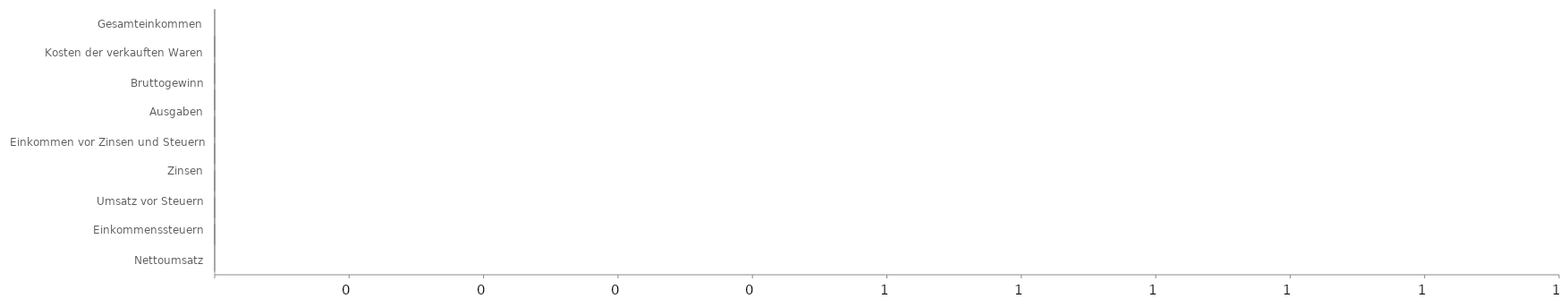
| Category | Ende | Leer | NegativerVerlust | NegativerGewinn | PositiverVerlust | PositiverGewinn |
|---|---|---|---|---|---|---|
| Gesamteinkommen | 0 | 0 | 0 | 0 | 0 | 0 |
| Kosten der verkauften Waren | 0 | 0 | 0 | 0 | 0 | 0 |
| Bruttogewinn | 0 | 0 | 0 | 0 | 0 | 0 |
| Ausgaben | 0 | 0 | 0 | 0 | 0 | 0 |
| Einkommen vor Zinsen und Steuern | 0 | 0 | 0 | 0 | 0 | 0 |
| Zinsen | 0 | 0 | 0 | 0 | 0 | 0 |
| Umsatz vor Steuern | 0 | 0 | 0 | 0 | 0 | 0 |
| Einkommenssteuern | 0 | 0 | 0 | 0 | 0 | 0 |
| Nettoumsatz | 0 | 0 | 0 | 0 | 0 | 0 |